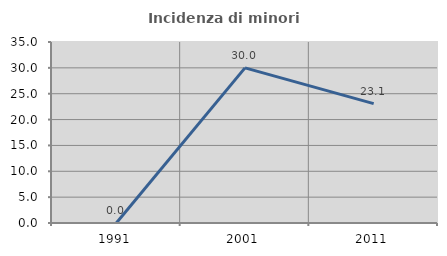
| Category | Incidenza di minori stranieri |
|---|---|
| 1991.0 | 0 |
| 2001.0 | 30 |
| 2011.0 | 23.077 |